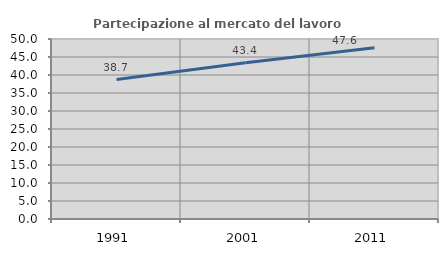
| Category | Partecipazione al mercato del lavoro  femminile |
|---|---|
| 1991.0 | 38.746 |
| 2001.0 | 43.39 |
| 2011.0 | 47.585 |